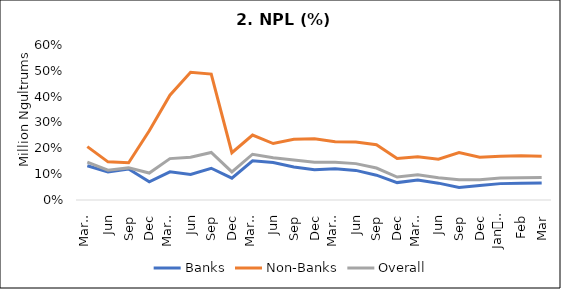
| Category | Banks | Non-Banks | Overall |
|---|---|---|---|
| 0 | 0.133 | 0.207 | 0.146 |
| 1 | 0.108 | 0.148 | 0.115 |
| 2 | 0.12 | 0.144 | 0.124 |
| 3 | 0.07 | 0.268 | 0.104 |
| 4 | 0.109 | 0.406 | 0.16 |
| 5 | 0.099 | 0.495 | 0.165 |
| 6 | 0.123 | 0.487 | 0.184 |
| 7 | 0.084 | 0.183 | 0.109 |
| 8 | 0.152 | 0.251 | 0.177 |
| 9 | 0.145 | 0.218 | 0.164 |
| 10 | 0.128 | 0.235 | 0.154 |
| 11 | 0.117 | 0.237 | 0.146 |
| 12 | 0.121 | 0.226 | 0.146 |
| 13 | 0.115 | 0.224 | 0.141 |
| 14 | 0.096 | 0.214 | 0.124 |
| 15 | 0.067 | 0.16 | 0.089 |
| 16 | 0.077 | 0.168 | 0.098 |
| 17 | 0.065 | 0.158 | 0.086 |
| 18 | 0.048 | 0.183 | 0.078 |
| 19 | 0.057 | 0.165 | 0.079 |
| 20 | 0.063 | 0.169 | 0.085 |
| 21 | 0.065 | 0.171 | 0.086 |
| 22 | 0.066 | 0.169 | 0.087 |